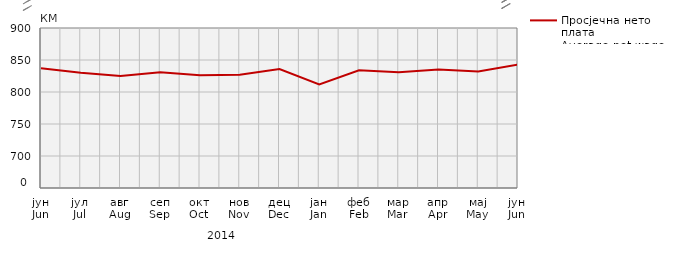
| Category | Просјечна нето плата
Average net wage |
|---|---|
| јун
Jun | 837 |
| јул
Jul | 830 |
| авг
Aug | 825 |
| сеп
Sep | 831 |
| окт
Oct | 826 |
| нов
Nov | 827 |
| дец
Dec | 836 |
| јан
Jan | 812 |
| феб
Feb | 834 |
| мар
Mar | 831 |
| апр
Apr | 835 |
| мај
May | 832 |
| јун
Jun | 843 |